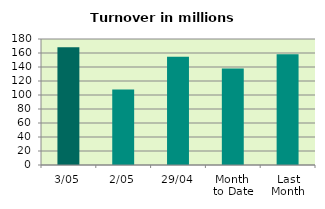
| Category | Series 0 |
|---|---|
| 3/05 | 168.057 |
| 2/05 | 107.894 |
| 29/04 | 154.586 |
| Month 
to Date | 137.975 |
| Last
Month | 158.303 |